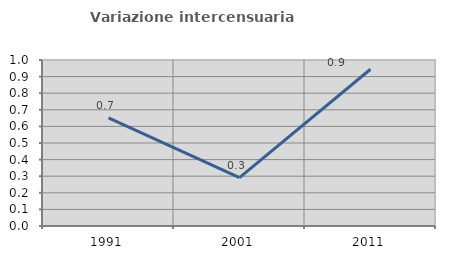
| Category | Variazione intercensuaria annua |
|---|---|
| 1991.0 | 0.651 |
| 2001.0 | 0.291 |
| 2011.0 | 0.944 |